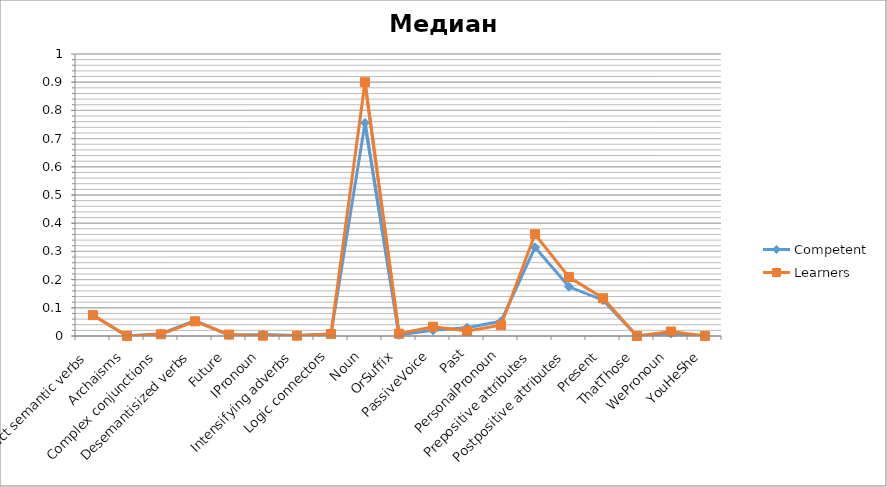
| Category | Competent | Learners |
|---|---|---|
| Abstract semantic verbs | 0.074 | 0.074 |
| Archaisms | 0 | 0 |
| Complex conjunctions | 0.008 | 0.006 |
| Desemantisized verbs | 0.054 | 0.052 |
| Future | 0.003 | 0.005 |
| IPronoun | 0.005 | 0.001 |
| Intensifying adverbs | 0.002 | 0.001 |
| Logic connectors | 0.007 | 0.007 |
| Noun | 0.756 | 0.9 |
| OrSuffix | 0.004 | 0.008 |
| PassiveVoice | 0.02 | 0.033 |
| Past | 0.03 | 0.018 |
| PersonalPronoun | 0.052 | 0.038 |
| Prepositive attributes | 0.314 | 0.361 |
| Postpositive attributes | 0.174 | 0.209 |
| Present | 0.127 | 0.134 |
| ThatThose | 0 | 0 |
| WePronoun | 0.009 | 0.016 |
| YouHeShe | 0 | 0 |